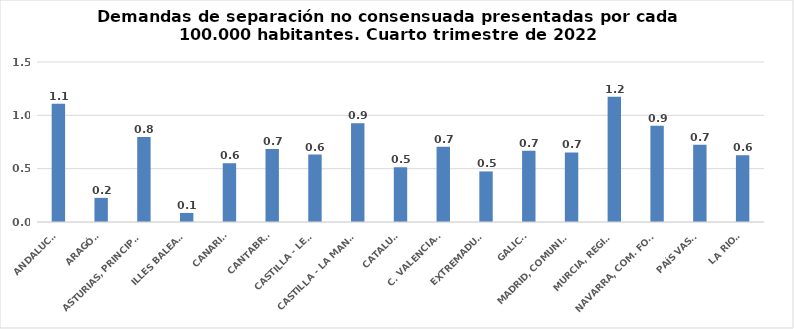
| Category | Series 0 |
|---|---|
| ANDALUCÍA | 1.107 |
| ARAGÓN | 0.226 |
| ASTURIAS, PRINCIPADO | 0.796 |
| ILLES BALEARS | 0.085 |
| CANARIAS | 0.551 |
| CANTABRIA | 0.683 |
| CASTILLA - LEÓN | 0.632 |
| CASTILLA - LA MANCHA | 0.925 |
| CATALUÑA | 0.513 |
| C. VALENCIANA | 0.706 |
| EXTREMADURA | 0.474 |
| GALICIA | 0.669 |
| MADRID, COMUNIDAD | 0.652 |
| MURCIA, REGIÓN | 1.175 |
| NAVARRA, COM. FORAL | 0.903 |
| PAÍS VASCO | 0.725 |
| LA RIOJA | 0.625 |